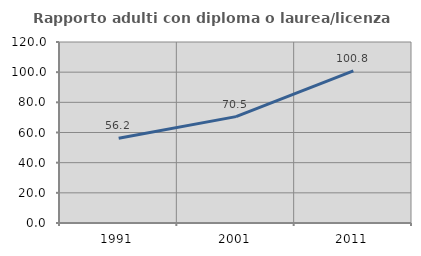
| Category | Rapporto adulti con diploma o laurea/licenza media  |
|---|---|
| 1991.0 | 56.237 |
| 2001.0 | 70.509 |
| 2011.0 | 100.803 |